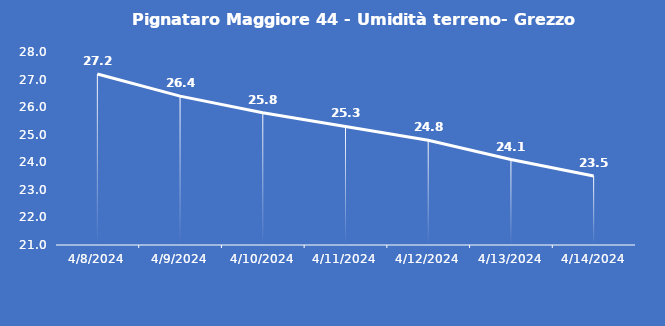
| Category | Pignataro Maggiore 44 - Umidità terreno- Grezzo (%VWC) |
|---|---|
| 4/8/24 | 27.2 |
| 4/9/24 | 26.4 |
| 4/10/24 | 25.8 |
| 4/11/24 | 25.3 |
| 4/12/24 | 24.8 |
| 4/13/24 | 24.1 |
| 4/14/24 | 23.5 |